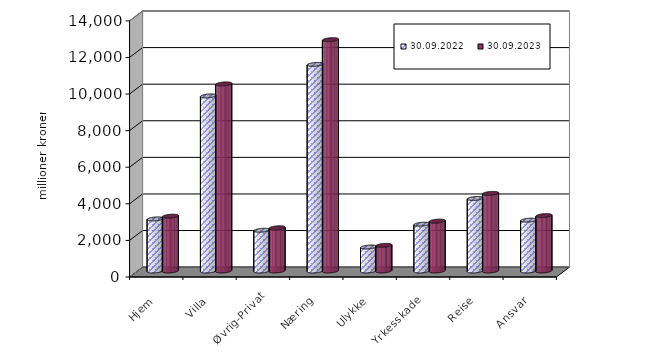
| Category | 30.09.2022 | 30.09.2023 |
|---|---|---|
| Hjem | 2847.876 | 2995.663 |
| Villa | 9571.09 | 10226.483 |
| Øvrig-Privat | 2227.112 | 2362.051 |
| Næring | 11292.428 | 12644.755 |
| Ulykke | 1311.8 | 1401.167 |
| Yrkesskade | 2558.61 | 2726.375 |
| Reise | 3966.629 | 4243.015 |
| Ansvar | 2779.911 | 3027.758 |